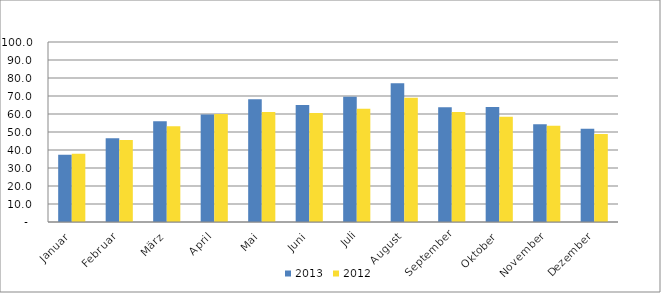
| Category | 2013 | 2012 |
|---|---|---|
| Januar | 37.314 | 37.925 |
| Februar | 46.493 | 45.494 |
| März | 56.037 | 53.258 |
| April | 59.712 | 60.059 |
| Mai | 68.179 | 61.067 |
| Juni | 64.95 | 60.508 |
| Juli | 69.615 | 62.854 |
| August | 77.108 | 69.078 |
| September | 63.808 | 61.166 |
| Oktober | 63.897 | 58.436 |
| November | 54.251 | 53.519 |
| Dezember | 51.835 | 48.937 |